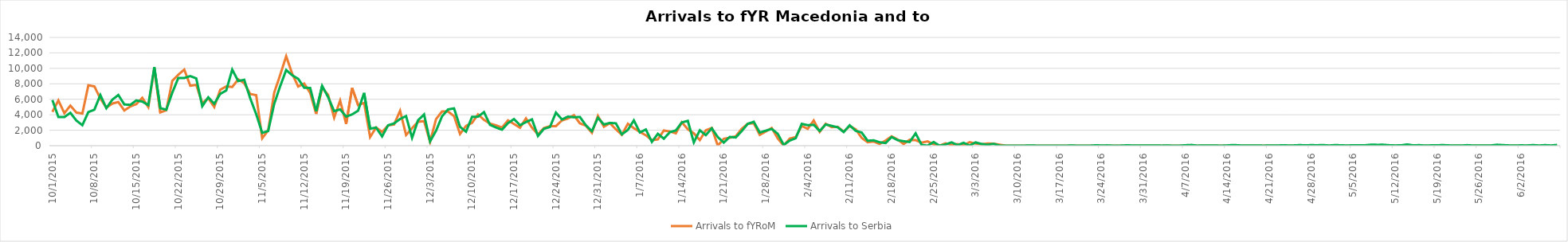
| Category | Arrivals to fYRoM | Arrivals to Serbia |
|---|---|---|
| 10/1/15 | 4370 | 5900 |
| 10/2/15 | 5853 | 3700 |
| 10/3/15 | 4202 | 3700 |
| 10/4/15 | 5181 | 4250 |
| 10/5/15 | 4282 | 3250 |
| 10/6/15 | 4156 | 2650 |
| 10/7/15 | 7816 | 4350 |
| 10/8/15 | 7663 | 4650 |
| 10/9/15 | 6107 | 6550 |
| 10/10/15 | 4922 | 4850 |
| 10/11/15 | 5448 | 5950 |
| 10/12/15 | 5645 | 6556 |
| 10/13/15 | 4551 | 5330 |
| 10/14/15 | 5073 | 5280 |
| 10/15/15 | 5373 | 5850 |
| 10/16/15 | 6181 | 5700 |
| 10/17/15 | 4988 | 5250 |
| 10/18/15 | 10005 | 10150 |
| 10/19/15 | 4299 | 4850 |
| 10/20/15 | 4584 | 4650 |
| 10/21/15 | 8384 | 6850 |
| 10/22/15 | 9174 | 8750 |
| 10/23/15 | 9840 | 8750 |
| 10/24/15 | 7752 | 9000 |
| 10/25/15 | 7864 | 8700 |
| 10/26/15 | 5500 | 5100 |
| 10/27/15 | 6146 | 6257 |
| 10/28/15 | 5000 | 5415 |
| 10/29/15 | 7231 | 6700 |
| 10/30/15 | 7663 | 7138 |
| 10/31/15 | 7590 | 9834 |
| 11/1/15 | 8584 | 8354 |
| 11/2/15 | 8075 | 8521 |
| 11/3/15 | 6682 | 6129 |
| 11/4/15 | 6532 | 4073 |
| 11/5/15 | 960 | 1652 |
| 11/6/15 | 1987 | 1906 |
| 11/7/15 | 6847 | 5397 |
| 11/8/15 | 9148 | 7695 |
| 11/9/15 | 11572 | 9785 |
| 11/10/15 | 9305 | 9107 |
| 11/11/15 | 7651 | 8648 |
| 11/12/15 | 8038 | 7500 |
| 11/13/15 | 6826 | 7464 |
| 11/14/15 | 4107 | 4453 |
| 11/15/15 | 7511 | 7734 |
| 11/16/15 | 6557 | 6267 |
| 11/17/15 | 3621 | 4460 |
| 11/18/15 | 5831 | 4694 |
| 11/19/15 | 2816 | 3765 |
| 11/20/15 | 7453 | 4042 |
| 11/21/15 | 5255 | 4527 |
| 11/22/15 | 5539 | 6826 |
| 11/23/15 | 1113 | 2201 |
| 11/24/15 | 2347 | 2335 |
| 11/25/15 | 1779 | 1194 |
| 11/26/15 | 2617 | 2636 |
| 11/27/15 | 2744 | 2878 |
| 11/28/15 | 4520 | 3454 |
| 11/29/15 | 1373 | 3825 |
| 11/30/15 | 2270 | 1009 |
| 12/1/15 | 3094 | 3284 |
| 12/2/15 | 3174 | 4040 |
| 12/3/15 | 494 | 553 |
| 12/4/15 | 3436 | 1927 |
| 12/5/15 | 4430 | 3799 |
| 12/6/15 | 4425 | 4686 |
| 12/7/15 | 3826 | 4823 |
| 12/8/15 | 1508 | 2437 |
| 12/9/15 | 2550 | 1807 |
| 12/10/15 | 2956 | 3723 |
| 12/11/15 | 4047 | 3747 |
| 12/12/15 | 3338 | 4339 |
| 12/13/15 | 2849 | 2698 |
| 12/14/15 | 2644 | 2353 |
| 12/15/15 | 2349 | 2067 |
| 12/16/15 | 3264 | 2916 |
| 12/17/15 | 2801 | 3438 |
| 12/18/15 | 2332 | 2649 |
| 12/19/15 | 3515 | 3052 |
| 12/20/15 | 2338 | 3405 |
| 12/21/15 | 1470 | 1253 |
| 12/22/15 | 2272 | 2186 |
| 12/23/15 | 2529 | 2415 |
| 12/24/15 | 2529 | 4279 |
| 12/25/15 | 3268 | 3390 |
| 12/26/15 | 3521 | 3757 |
| 12/27/15 | 3938 | 3674 |
| 12/28/15 | 2884 | 3708 |
| 12/29/15 | 2577 | 2629 |
| 12/30/15 | 1665 | 1879 |
| 12/31/15 | 3848 | 3602 |
| 1/1/16 | 2454 | 2745 |
| 1/2/16 | 2918 | 2947 |
| 1/3/16 | 2112 | 2889 |
| 1/4/16 | 1415 | 1462 |
| 1/5/16 | 2842 | 2041 |
| 1/6/16 | 2258 | 3273 |
| 1/7/16 | 1776 | 1715 |
| 1/8/16 | 1344 | 2100 |
| 1/9/16 | 715 | 489 |
| 1/10/16 | 819 | 1538 |
| 1/11/16 | 1959 | 905 |
| 1/12/16 | 1840 | 1743 |
| 1/13/16 | 1600 | 1973 |
| 1/14/16 | 3022 | 3006 |
| 1/15/16 | 2119 | 3213 |
| 1/16/16 | 1598 | 415 |
| 1/17/16 | 720 | 1995 |
| 1/18/16 | 1980 | 1362 |
| 1/19/16 | 2298 | 2244 |
| 1/20/16 | 0 | 1113 |
| 1/21/16 | 892 | 397 |
| 1/22/16 | 1030 | 1134 |
| 1/23/16 | 1208 | 1064 |
| 1/24/16 | 2174 | 1895 |
| 1/25/16 | 2836 | 2827 |
| 1/26/16 | 2908 | 3091 |
| 1/27/16 | 1402 | 1695 |
| 1/28/16 | 1837 | 1940 |
| 1/29/16 | 2292 | 2167 |
| 1/30/16 | 931 | 1540 |
| 1/31/16 | 0 | 103 |
| 2/1/16 | 908 | 660 |
| 2/2/16 | 1121 | 966 |
| 2/3/16 | 2558 | 2825 |
| 2/4/16 | 2173 | 2653 |
| 2/5/16 | 3259 | 2694 |
| 2/6/16 | 1780 | 1901 |
| 2/7/16 | 2838 | 2739 |
| 2/8/16 | 2392 | 2563 |
| 2/9/16 | 2441 | 2379 |
| 2/10/16 | 1817 | 1758 |
| 2/11/16 | 2540 | 2636 |
| 2/12/16 | 2115 | 1923 |
| 2/13/16 | 1019 | 1699 |
| 2/14/16 | 452 | 641 |
| 2/15/16 | 542 | 691 |
| 2/16/16 | 234 | 443 |
| 2/17/16 | 668 | 345 |
| 2/18/16 | 1200 | 1117 |
| 2/19/16 | 799 | 713 |
| 2/20/16 | 209 | 580 |
| 2/21/16 | 774 | 476 |
| 2/22/16 | 714 | 1595 |
| 2/23/16 | 382 | 106 |
| 2/24/16 | 551 | 1 |
| 2/25/16 | 168 | 475 |
| 2/26/16 | 20 | 0 |
| 2/27/16 | 310 | 158 |
| 2/28/16 | 92 | 431 |
| 2/29/16 | 208 | 69 |
| 3/1/16 | 30 | 372 |
| 3/2/16 | 457 | 16 |
| 3/3/16 | 269 | 428 |
| 3/4/16 | 177 | 218 |
| 3/5/16 | 293 | 115 |
| 3/6/16 | 261 | 236 |
| 3/7/16 | 127 | 14 |
| 3/8/16 | 0 | 0 |
| 3/9/16 | 0 | 3 |
| 3/10/16 | 0 | 0 |
| 3/11/16 | 0 | 0 |
| 3/12/16 | 0 | 35 |
| 3/13/16 | 0 | 12 |
| 3/14/16 | 0 | 0 |
| 3/15/16 | 0 | 0 |
| 3/16/16 | 0 | 0 |
| 3/17/16 | 0 | 0 |
| 3/18/16 | 0 | 0 |
| 3/19/16 | 0 | 30 |
| 3/20/16 | 0 | 0 |
| 3/21/16 | 0 | 0 |
| 3/22/16 | 0 | 0 |
| 3/23/16 | 0 | 49 |
| 3/24/16 | 0 | 31 |
| 3/25/16 | 0 | 40 |
| 3/26/16 | 0 | 0 |
| 3/27/16 | 0 | 4 |
| 3/28/16 | 0 | 42 |
| 3/29/16 | 0 | 37 |
| 3/30/16 | 0 | 21 |
| 3/31/16 | 0 | 14 |
| 4/1/16 | 0 | 28 |
| 4/2/16 | 0 | 32 |
| 4/3/16 | 0 | 10 |
| 4/4/16 | 0 | 28 |
| 4/5/16 | 0 | 0 |
| 4/6/16 | 0 | 4 |
| 4/7/16 | 0 | 58 |
| 4/8/16 | 0 | 93 |
| 4/9/16 | 0 | 8 |
| 4/10/16 | 0 | 30 |
| 4/11/16 | 0 | 34 |
| 4/12/16 | 0 | 22 |
| 4/13/16 | 0 | 3 |
| 4/14/16 | 0 | 34 |
| 4/15/16 | 0 | 90 |
| 4/16/16 | 0 | 41 |
| 4/17/16 | 0 | 15 |
| 4/18/16 | 0 | 17 |
| 4/19/16 | 0 | 34 |
| 4/20/16 | 0 | 5 |
| 4/21/16 | 0 | 31 |
| 4/22/16 | 0 | 19 |
| 4/23/16 | 0 | 45 |
| 4/24/16 | 0 | 38 |
| 4/25/16 | 0 | 34 |
| 4/26/16 | 0 | 73 |
| 4/27/16 | 0 | 54 |
| 4/28/16 | 0 | 69 |
| 4/29/16 | 0 | 59 |
| 4/30/16 | 0 | 80 |
| 5/1/16 | 0 | 26 |
| 5/2/16 | 0 | 81 |
| 5/3/16 | 0 | 50 |
| 5/4/16 | 0 | 25 |
| 5/5/16 | 0 | 58 |
| 5/6/16 | 0 | 49 |
| 5/7/16 | 0 | 59 |
| 5/8/16 | 0 | 128 |
| 5/9/16 | 0 | 113 |
| 5/10/16 | 0 | 119 |
| 5/11/16 | 0 | 62 |
| 5/12/16 | 0 | 33 |
| 5/13/16 | 0 | 51 |
| 5/14/16 | 0 | 161 |
| 5/15/16 | 0 | 45 |
| 5/16/16 | 0 | 71 |
| 5/17/16 | 0 | 17 |
| 5/18/16 | 0 | 44 |
| 5/19/16 | 0 | 55 |
| 5/20/16 | 0 | 74 |
| 5/21/16 | 0 | 39 |
| 5/22/16 | 0 | 16 |
| 5/23/16 | 0 | 15 |
| 5/24/16 | 0 | 68 |
| 5/25/16 | 0 | 23 |
| 5/26/16 | 0 | 15 |
| 5/27/16 | 0 | 20 |
| 5/28/16 | 0 | 35 |
| 5/29/16 | 0 | 121 |
| 5/30/16 | 0 | 75 |
| 5/31/16 | 0 | 37 |
| 6/1/16 | 0 | 29 |
| 6/2/16 | 0 | 43 |
| 6/3/16 | 0 | 32 |
| 6/4/16 | 0 | 80 |
| 6/5/16 | 0 | 26 |
| 6/6/16 | 0 | 74 |
| 6/7/16 | 0 | 28 |
| 6/8/16 | 0 | 101 |